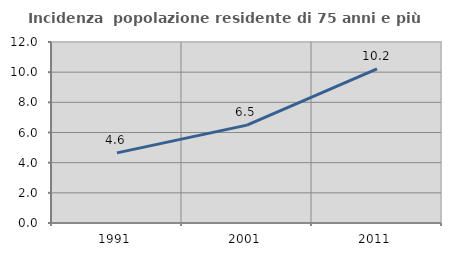
| Category | Incidenza  popolazione residente di 75 anni e più |
|---|---|
| 1991.0 | 4.648 |
| 2001.0 | 6.49 |
| 2011.0 | 10.221 |